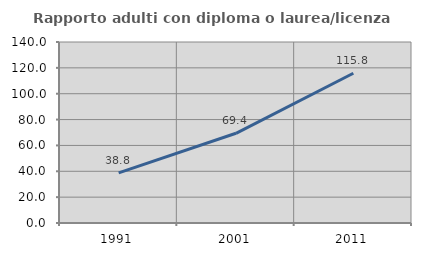
| Category | Rapporto adulti con diploma o laurea/licenza media  |
|---|---|
| 1991.0 | 38.824 |
| 2001.0 | 69.385 |
| 2011.0 | 115.815 |